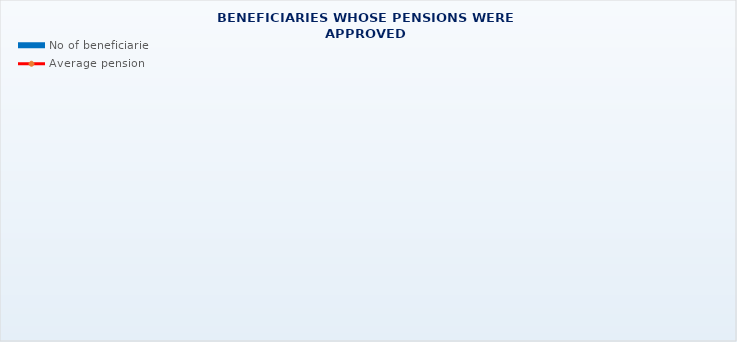
| Category | No of beneficiaries |
|---|---|
| Authorised officials in internal affairs, judicial officers and workers engaged in demining work: | 17264 |
| Pension beneficiaries entitled under the Fire Services Act (Official Gazette 125/19)* | 63 |
| Active military personnel - DVO  | 15856 |
| Croatian Homeland Army veterans mobilised from 1941 to 1945 | 3428 |
| Former political prisoners | 2644 |
| Croatian Veterans from the Homeland War - ZOHBDR (Act on Croatian Homeland War Veterans and Their Family Members) | 71032 |
| Pensions approved under general regulations and determined according to the Act on the Rights of Croatian Homeland War Veterans and their Family Members (ZOHBDR), in 2017 (Art. 27, 35, 48 and 49, paragraph 2)    | 46472 |
| Former Yugoslav People's Army members - JNA   | 4972 |
| Former Yugoslav People's Army members - JNA - Art. 185 of Pension Insurance Act (ZOMO)  | 157 |
| National Liberation War veterans - NOR | 8319 |
| Members of the Croatian Parliament, members of the Government, judges of the Constitutional Court and the Auditor General | 685 |
| Members of the Parliamentary Executive Council and administratively retired federal civil servants  (relates to the former SFRY) | 88 |
| Former officials of federal bodies o the former SFRJ -  Article 38 of the Pension Insurance Act (ZOMO) | 32 |
| Full members of the Croatian Academy of Sciences and Arts - HAZU | 137 |
| Miners from the Istrian coal mines "Tupljak" d.d. Labin  | 253 |
| Workers professionally exposed to asbestos | 858 |
| Insurees - crew members on a ship in international and national navigation  - Article  129, paragraph 2 of the Maritime Code | 189 |
| Members of the Croatian Defence Council - HVO  | 6778 |